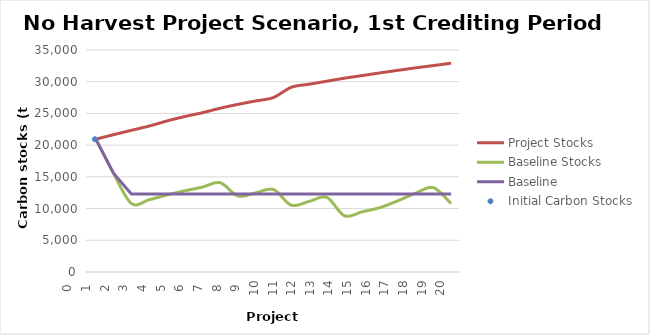
| Category | Project Stocks | Baseline Stocks | Baseline |
|---|---|---|---|
| 0.0 | 20939.76 | 20939.76 | 20939.76 |
| 1.0 | 21653.507 | 15536.826 | 15536.826 |
| 2.0 | 22341.24 | 10801.472 | 12295.564 |
| 3.0 | 23004.79 | 11392.475 | 12295.564 |
| 4.0 | 23811.603 | 12145.794 | 12295.564 |
| 5.0 | 24507.397 | 12795.421 | 12295.564 |
| 6.0 | 25114.155 | 13386.424 | 12295.564 |
| 7.0 | 25823.872 | 14081.851 | 12295.564 |
| 8.0 | 26432.829 | 11973.952 | 12295.564 |
| 9.0 | 26969.605 | 12481.416 | 12295.564 |
| 10.0 | 27511.144 | 12999.872 | 12295.564 |
| 11.0 | 29119.444 | 10535.466 | 12295.564 |
| 12.0 | 29603.458 | 11117.309 | 12295.564 |
| 13.0 | 30080.511 | 11771.333 | 12295.564 |
| 14.0 | 30556.465 | 8851.858 | 12295.564 |
| 15.0 | 30973.428 | 9496.722 | 12295.564 |
| 16.0 | 31395.154 | 10157.341 | 12295.564 |
| 17.0 | 31794.53 | 11228.328 | 12295.564 |
| 18.0 | 32186.945 | 12418.762 | 12295.564 |
| 19.0 | 32546.383 | 13305.083 | 12295.564 |
| 20.0 | 32923.042 | 10789.381 | 12295.564 |